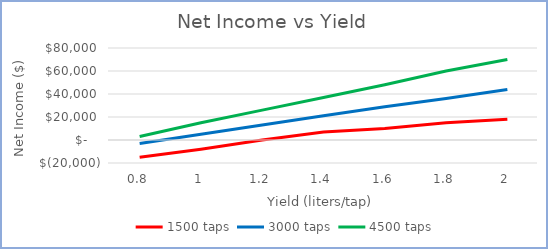
| Category | 1500 taps | 3000 taps | 4500 taps |
|---|---|---|---|
| 0.8 | -15000 | -3000 | 3000 |
| 1.0 | -8000 | 5000 | 15000 |
| 1.2 | 0 | 13000 | 26000 |
| 1.4 | 7000 | 21000 | 37000 |
| 1.6 | 10000 | 29000 | 48000 |
| 1.8 | 15000 | 36000 | 60000 |
| 2.0 | 18000 | 44000 | 70000 |